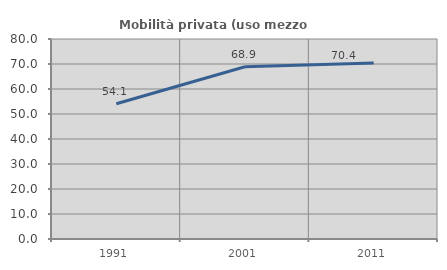
| Category | Mobilità privata (uso mezzo privato) |
|---|---|
| 1991.0 | 54.123 |
| 2001.0 | 68.926 |
| 2011.0 | 70.441 |